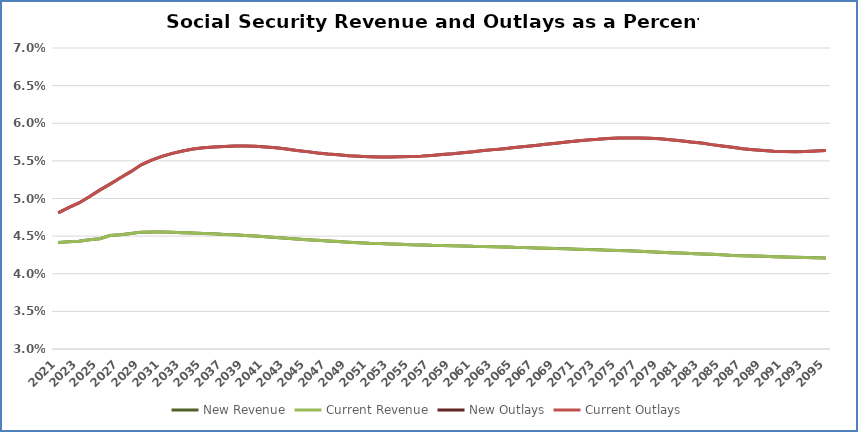
| Category | New Revenue | Current Revenue | New Outlays | Current Outlays |
|---|---|---|---|---|
| 2021.0 | 0.044 | 0.044 | 0.048 | 0.048 |
| 2022.0 | 0.044 | 0.044 | 0.049 | 0.049 |
| 2023.0 | 0.044 | 0.044 | 0.049 | 0.049 |
| 2024.0 | 0.045 | 0.045 | 0.05 | 0.05 |
| 2025.0 | 0.045 | 0.045 | 0.051 | 0.051 |
| 2026.0 | 0.045 | 0.045 | 0.052 | 0.052 |
| 2027.0 | 0.045 | 0.045 | 0.053 | 0.053 |
| 2028.0 | 0.045 | 0.045 | 0.054 | 0.054 |
| 2029.0 | 0.046 | 0.046 | 0.054 | 0.054 |
| 2030.0 | 0.046 | 0.046 | 0.055 | 0.055 |
| 2031.0 | 0.046 | 0.046 | 0.056 | 0.056 |
| 2032.0 | 0.046 | 0.046 | 0.056 | 0.056 |
| 2033.0 | 0.045 | 0.045 | 0.056 | 0.056 |
| 2034.0 | 0.045 | 0.045 | 0.057 | 0.057 |
| 2035.0 | 0.045 | 0.045 | 0.057 | 0.057 |
| 2036.0 | 0.045 | 0.045 | 0.057 | 0.057 |
| 2037.0 | 0.045 | 0.045 | 0.057 | 0.057 |
| 2038.0 | 0.045 | 0.045 | 0.057 | 0.057 |
| 2039.0 | 0.045 | 0.045 | 0.057 | 0.057 |
| 2040.0 | 0.045 | 0.045 | 0.057 | 0.057 |
| 2041.0 | 0.045 | 0.045 | 0.057 | 0.057 |
| 2042.0 | 0.045 | 0.045 | 0.057 | 0.057 |
| 2043.0 | 0.045 | 0.045 | 0.057 | 0.057 |
| 2044.0 | 0.045 | 0.045 | 0.056 | 0.056 |
| 2045.0 | 0.045 | 0.045 | 0.056 | 0.056 |
| 2046.0 | 0.044 | 0.044 | 0.056 | 0.056 |
| 2047.0 | 0.044 | 0.044 | 0.056 | 0.056 |
| 2048.0 | 0.044 | 0.044 | 0.056 | 0.056 |
| 2049.0 | 0.044 | 0.044 | 0.056 | 0.056 |
| 2050.0 | 0.044 | 0.044 | 0.056 | 0.056 |
| 2051.0 | 0.044 | 0.044 | 0.056 | 0.056 |
| 2052.0 | 0.044 | 0.044 | 0.056 | 0.056 |
| 2053.0 | 0.044 | 0.044 | 0.056 | 0.056 |
| 2054.0 | 0.044 | 0.044 | 0.056 | 0.056 |
| 2055.0 | 0.044 | 0.044 | 0.056 | 0.056 |
| 2056.0 | 0.044 | 0.044 | 0.056 | 0.056 |
| 2057.0 | 0.044 | 0.044 | 0.056 | 0.056 |
| 2058.0 | 0.044 | 0.044 | 0.056 | 0.056 |
| 2059.0 | 0.044 | 0.044 | 0.056 | 0.056 |
| 2060.0 | 0.044 | 0.044 | 0.056 | 0.056 |
| 2061.0 | 0.044 | 0.044 | 0.056 | 0.056 |
| 2062.0 | 0.044 | 0.044 | 0.056 | 0.056 |
| 2063.0 | 0.044 | 0.044 | 0.056 | 0.056 |
| 2064.0 | 0.044 | 0.044 | 0.057 | 0.057 |
| 2065.0 | 0.044 | 0.044 | 0.057 | 0.057 |
| 2066.0 | 0.043 | 0.043 | 0.057 | 0.057 |
| 2067.0 | 0.043 | 0.043 | 0.057 | 0.057 |
| 2068.0 | 0.043 | 0.043 | 0.057 | 0.057 |
| 2069.0 | 0.043 | 0.043 | 0.057 | 0.057 |
| 2070.0 | 0.043 | 0.043 | 0.058 | 0.058 |
| 2071.0 | 0.043 | 0.043 | 0.058 | 0.058 |
| 2072.0 | 0.043 | 0.043 | 0.058 | 0.058 |
| 2073.0 | 0.043 | 0.043 | 0.058 | 0.058 |
| 2074.0 | 0.043 | 0.043 | 0.058 | 0.058 |
| 2075.0 | 0.043 | 0.043 | 0.058 | 0.058 |
| 2076.0 | 0.043 | 0.043 | 0.058 | 0.058 |
| 2077.0 | 0.043 | 0.043 | 0.058 | 0.058 |
| 2078.0 | 0.043 | 0.043 | 0.058 | 0.058 |
| 2079.0 | 0.043 | 0.043 | 0.058 | 0.058 |
| 2080.0 | 0.043 | 0.043 | 0.058 | 0.058 |
| 2081.0 | 0.043 | 0.043 | 0.058 | 0.058 |
| 2082.0 | 0.043 | 0.043 | 0.058 | 0.058 |
| 2083.0 | 0.043 | 0.043 | 0.057 | 0.057 |
| 2084.0 | 0.043 | 0.043 | 0.057 | 0.057 |
| 2085.0 | 0.043 | 0.043 | 0.057 | 0.057 |
| 2086.0 | 0.042 | 0.042 | 0.057 | 0.057 |
| 2087.0 | 0.042 | 0.042 | 0.057 | 0.057 |
| 2088.0 | 0.042 | 0.042 | 0.056 | 0.056 |
| 2089.0 | 0.042 | 0.042 | 0.056 | 0.056 |
| 2090.0 | 0.042 | 0.042 | 0.056 | 0.056 |
| 2091.0 | 0.042 | 0.042 | 0.056 | 0.056 |
| 2092.0 | 0.042 | 0.042 | 0.056 | 0.056 |
| 2093.0 | 0.042 | 0.042 | 0.056 | 0.056 |
| 2094.0 | 0.042 | 0.042 | 0.056 | 0.056 |
| 2095.0 | 0.042 | 0.042 | 0.056 | 0.056 |